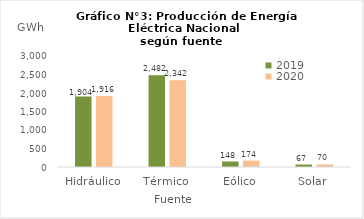
| Category | 2019 | 2020 |
|---|---|---|
| Hidráulico | 1904.21 | 1915.782 |
| Térmico | 2481.501 | 2342.418 |
| Eólico | 148.463 | 173.608 |
| Solar | 67.258 | 70.43 |